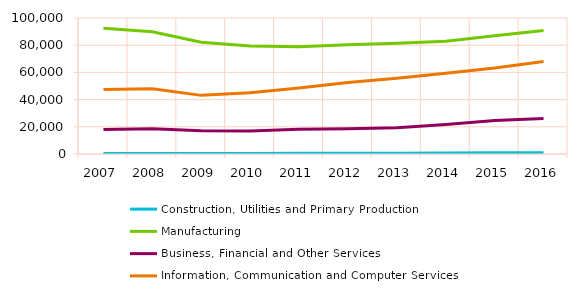
| Category | Construction, Utilities and Primary Production | Manufacturing | Business, Financial and Other Services | Information, Communication and Computer Services |
|---|---|---|---|---|
| 2007.0 | 434 | 92382 | 17981 | 47402 |
| 2008.0 | 393 | 89910 | 18591 | 47904 |
| 2009.0 | 431 | 82223 | 17164 | 43113 |
| 2010.0 | 436 | 79354 | 16995 | 44974 |
| 2011.0 | 493 | 78782 | 18186 | 48529 |
| 2012.0 | 575 | 80408 | 18651 | 52645 |
| 2013.0 | 634 | 81468 | 19348 | 55782 |
| 2014.0 | 716 | 82936 | 21605 | 59409 |
| 2015.0 | 987 | 86875 | 24591 | 63199 |
| 2016.0 | 915 | 90794 | 26052 | 68012 |